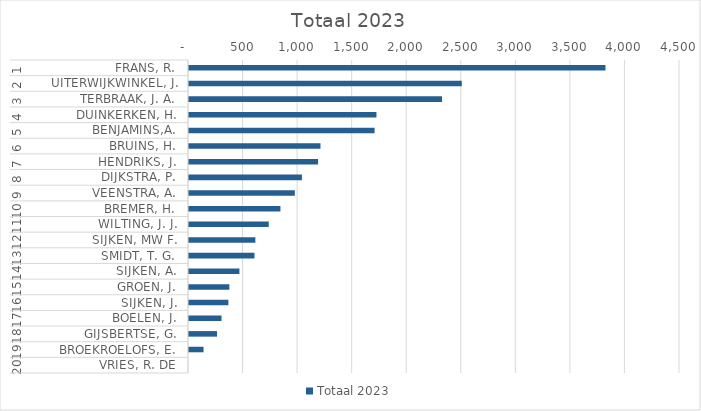
| Category | Totaal 2023 |
|---|---|
| 0 | 3817 |
| 1 | 2500 |
| 2 | 2319 |
| 3 | 1718 |
| 4 | 1701 |
| 5 | 1205 |
| 6 | 1183 |
| 7 | 1035 |
| 8 | 970 |
| 9 | 838 |
| 10 | 731 |
| 11 | 608 |
| 12 | 600 |
| 13 | 462 |
| 14 | 370 |
| 15 | 361 |
| 16 | 298 |
| 17 | 257 |
| 18 | 133 |
| 19 | 0 |